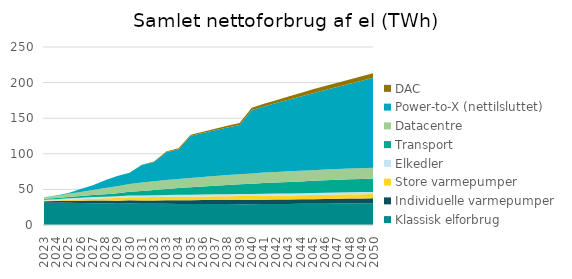
| Category | Klassisk elforbrug | Individuelle varmepumper | Store varmepumper | Elkedler | Transport | Datacentre | Power-to-X (nettilsluttet) | DAC |
|---|---|---|---|---|---|---|---|---|
| 2023.0 | 31.301 | 2.107 | 0.834 | 1.381 | 1.296 | 2.103 | 0.025 | 0 |
| 2024.0 | 31.13 | 2.468 | 0.837 | 1.716 | 1.602 | 3.065 | 0.545 | 0 |
| 2025.0 | 31.155 | 2.924 | 1.26 | 2.183 | 1.886 | 4.418 | 1.265 | 0 |
| 2026.0 | 30.849 | 3.32 | 1.862 | 2.385 | 2.249 | 5.523 | 4.375 | 0 |
| 2027.0 | 30.7 | 3.717 | 2.479 | 2.403 | 2.822 | 7.066 | 6.648 | 0 |
| 2028.0 | 30.393 | 3.953 | 3.053 | 2.421 | 3.479 | 8.503 | 10.895 | 0 |
| 2029.0 | 29.897 | 4.19 | 3.827 | 2.446 | 4.18 | 9.918 | 14.518 | 0 |
| 2030.0 | 30.161 | 4.427 | 4.35 | 2.537 | 5.207 | 10.872 | 15.818 | 0 |
| 2031.0 | 29.713 | 4.625 | 4.683 | 2.539 | 6.249 | 11.823 | 24.65 | 0.32 |
| 2032.0 | 29.712 | 4.823 | 4.752 | 2.539 | 7.258 | 12.335 | 27.15 | 0.64 |
| 2033.0 | 29.689 | 5.02 | 4.903 | 2.539 | 8.27 | 12.62 | 39.15 | 0.96 |
| 2034.0 | 29.656 | 5.218 | 5.065 | 2.599 | 9.271 | 12.904 | 41.65 | 1.28 |
| 2035.0 | 29.492 | 5.416 | 5.124 | 2.599 | 10.265 | 13.189 | 59.15 | 1.6 |
| 2036.0 | 29.419 | 5.551 | 5.192 | 2.708 | 11.212 | 13.473 | 61.65 | 1.92 |
| 2037.0 | 29.368 | 5.686 | 5.273 | 2.708 | 12.086 | 13.758 | 64.15 | 2.24 |
| 2038.0 | 29.328 | 5.821 | 5.369 | 2.802 | 12.902 | 14.008 | 66.65 | 2.56 |
| 2039.0 | 29.275 | 5.955 | 5.393 | 2.802 | 13.664 | 14.232 | 69.15 | 2.88 |
| 2040.0 | 29.313 | 6.09 | 5.454 | 2.802 | 14.374 | 14.455 | 89.15 | 3.2 |
| 2041.0 | 29.402 | 6.174 | 5.526 | 2.804 | 15.035 | 14.679 | 92.9 | 3.68 |
| 2042.0 | 29.496 | 6.258 | 5.578 | 2.81 | 15.631 | 14.791 | 96.65 | 4.16 |
| 2043.0 | 29.601 | 6.342 | 5.631 | 2.81 | 16.17 | 14.903 | 100.4 | 4.64 |
| 2044.0 | 29.696 | 6.426 | 5.667 | 2.81 | 16.66 | 15.015 | 104.15 | 5.12 |
| 2045.0 | 29.785 | 6.51 | 5.78 | 2.811 | 17.107 | 15.04 | 107.9 | 5.6 |
| 2046.0 | 29.966 | 6.622 | 5.836 | 2.821 | 17.518 | 15.065 | 111.65 | 5.76 |
| 2047.0 | 30.13 | 6.734 | 5.881 | 2.832 | 17.897 | 15.065 | 115.4 | 5.92 |
| 2048.0 | 30.294 | 6.846 | 5.915 | 2.836 | 18.251 | 15.065 | 119.15 | 6.08 |
| 2049.0 | 30.432 | 6.958 | 5.947 | 2.838 | 18.584 | 15.065 | 122.9 | 6.24 |
| 2050.0 | 30.575 | 7.069 | 5.992 | 2.849 | 18.9 | 15.065 | 126.65 | 6.4 |